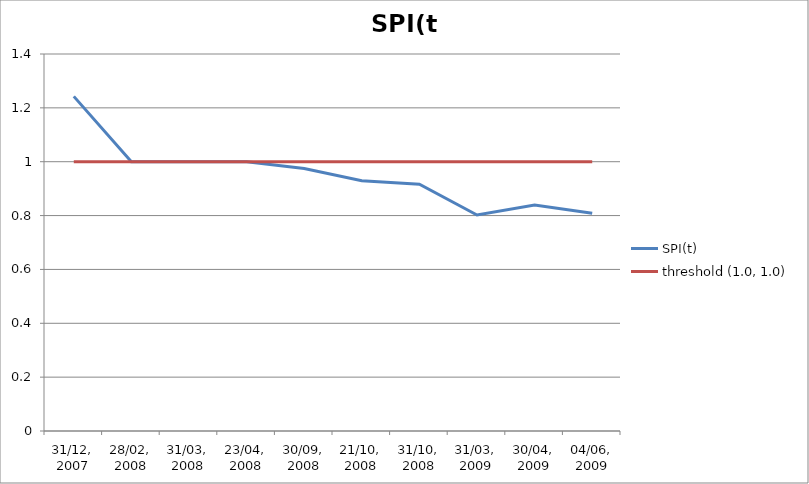
| Category | SPI(t) | threshold (1.0, 1.0) |
|---|---|---|
| 31/12, 2007 | 1.243 | 1 |
| 28/02, 2008 | 1 | 1 |
| 31/03, 2008 | 1 | 1 |
| 23/04, 2008 | 1 | 1 |
| 30/09, 2008 | 0.975 | 1 |
| 21/10, 2008 | 0.93 | 1 |
| 31/10, 2008 | 0.917 | 1 |
| 31/03, 2009 | 0.802 | 1 |
| 30/04, 2009 | 0.839 | 1 |
| 04/06, 2009 | 0.808 | 1 |